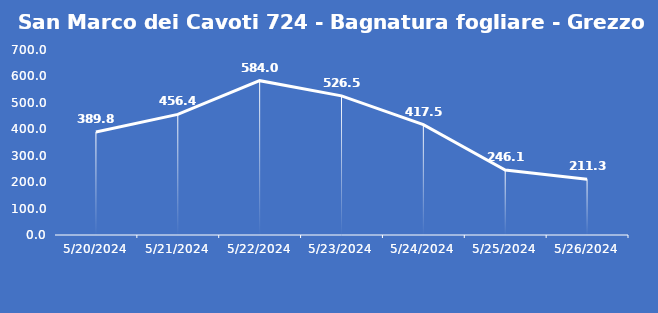
| Category | San Marco dei Cavoti 724 - Bagnatura fogliare - Grezzo (min) |
|---|---|
| 5/20/24 | 389.8 |
| 5/21/24 | 456.4 |
| 5/22/24 | 584 |
| 5/23/24 | 526.5 |
| 5/24/24 | 417.5 |
| 5/25/24 | 246.1 |
| 5/26/24 | 211.3 |